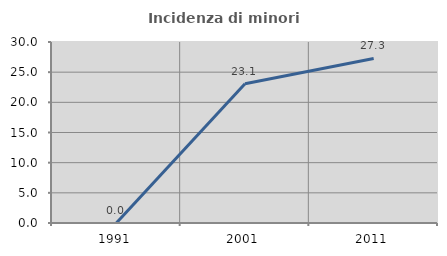
| Category | Incidenza di minori stranieri |
|---|---|
| 1991.0 | 0 |
| 2001.0 | 23.077 |
| 2011.0 | 27.273 |